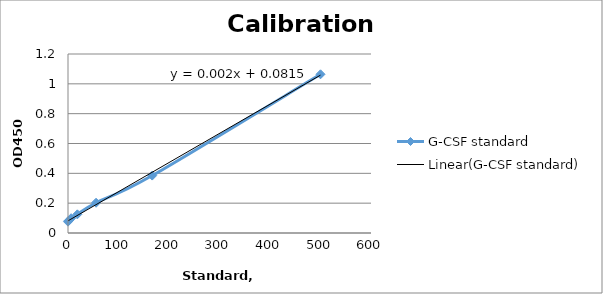
| Category | G-CSF standard |
|---|---|
| 0.0 | 0.076 |
| 0.69 | 0.081 |
| 2.05 | 0.084 |
| 6.17 | 0.099 |
| 18.52 | 0.125 |
| 55.56 | 0.203 |
| 166.7 | 0.385 |
| 500.0 | 1.064 |